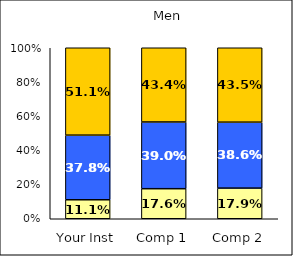
| Category | Low Social Agency | Average Social Agency | High Social Agency |
|---|---|---|---|
| Your Inst | 0.111 | 0.378 | 0.511 |
| Comp 1 | 0.176 | 0.39 | 0.434 |
| Comp 2 | 0.179 | 0.386 | 0.435 |